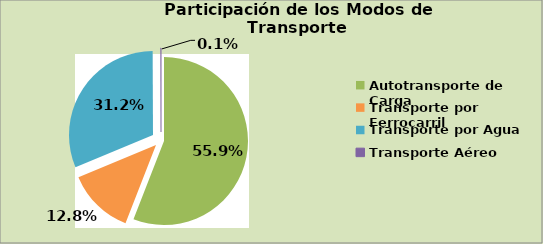
| Category | Series 0 |
|---|---|
| Autotransporte de Carga | 55.883 |
| Transporte por Ferrocarril | 12.793 |
| Transporte por Agua | 31.2 |
| Transporte Aéreo | 0.067 |